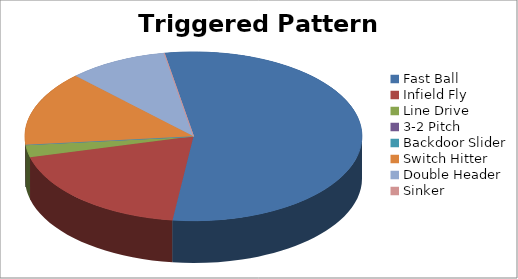
| Category | Triggered Pattern Distribution |
|---|---|
| Fast Ball | 23 |
| Infield Fly | 8 |
| Line Drive | 1 |
| 3-2 Pitch | 0 |
| Backdoor Slider | 0 |
| Switch Hitter | 6 |
| Double Header | 4 |
| Sinker | 0 |